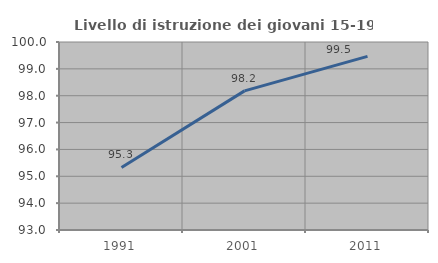
| Category | Livello di istruzione dei giovani 15-19 anni |
|---|---|
| 1991.0 | 95.328 |
| 2001.0 | 98.18 |
| 2011.0 | 99.466 |